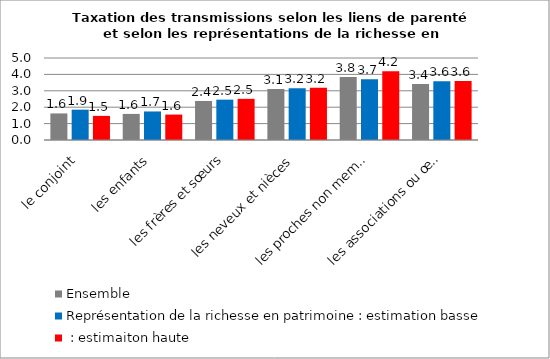
| Category | Ensemble | Représentation de la richesse en patrimoine : estimation basse | Représentation de la richesse en patrimoine : estimaiton haute |
|---|---|---|---|
| le conjoint | 1.62 | 1.85 | 1.47 |
| les enfants | 1.59 | 1.74 | 1.55 |
| les frères et sœurs | 2.38 | 2.46 | 2.51 |
| les neveux et nièces | 3.11 | 3.15 | 3.19 |
| les proches non membres de la famille | 3.84 | 3.71 | 4.19 |
| les associations ou œuvres d'utilité publique | 3.41 | 3.58 | 3.6 |